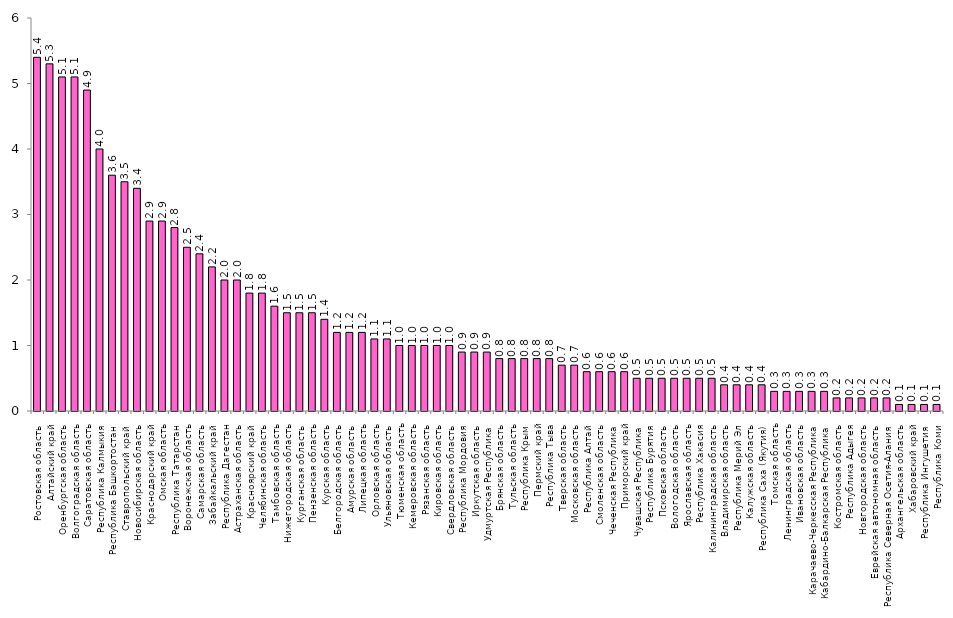
| Category | Series 0 |
|---|---|
| Ростовская область | 5.4 |
| Алтайский край | 5.3 |
| Оренбургская область | 5.1 |
| Волгоградская область | 5.1 |
| Саратовская область | 4.9 |
| Республика Калмыкия | 4 |
| Республика Башкортостан | 3.6 |
| Ставропольский край | 3.5 |
| Новосибирская область | 3.4 |
| Краснодарский край | 2.9 |
| Омская область | 2.9 |
| Республика Татарстан | 2.8 |
| Воронежская область | 2.5 |
| Самарская область | 2.4 |
| Забайкальский край | 2.2 |
| Республика Дагестан | 2 |
| Астраханская область | 2 |
| Красноярский край | 1.8 |
| Челябинская область | 1.8 |
| Тамбовская область | 1.6 |
| Нижегородская область | 1.5 |
| Курганская область | 1.5 |
| Пензенская область | 1.5 |
| Курская область | 1.4 |
| Белгородская область | 1.2 |
| Амурская область | 1.2 |
| Липецкая область | 1.2 |
| Орловская область | 1.1 |
| Ульяновская область | 1.1 |
| Тюменская область | 1 |
| Кемеровская область | 1 |
| Рязанская область | 1 |
| Кировская область | 1 |
| Свердловская область | 1 |
| Республика Мордовия | 0.9 |
| Иркутская область | 0.9 |
| Удмуртская Республика | 0.9 |
| Брянская область | 0.8 |
| Тульская область | 0.8 |
| Республика Крым | 0.8 |
| Пермский край | 0.8 |
| Республика Тыва | 0.8 |
| Тверская область | 0.7 |
| Московская область | 0.7 |
| Республика Алтай | 0.6 |
| Смоленская область | 0.6 |
| Чеченская Республика | 0.6 |
| Приморский край | 0.6 |
| Чувашская Республика | 0.5 |
| Республика Бурятия | 0.5 |
| Псковская область | 0.5 |
| Вологодская область | 0.5 |
| Ярославская область | 0.5 |
| Республика Хакасия | 0.5 |
| Калининградская область | 0.5 |
| Владимирская область | 0.4 |
| Республика Мерий Эл | 0.4 |
| Калужская область | 0.4 |
| Республика Саха (Якутия) | 0.4 |
| Томская область | 0.3 |
| Ленинградская область | 0.3 |
| Ивановская область | 0.3 |
| Карачаево-Черкесская Республика | 0.3 |
| Кабардино-Балкарская Республика | 0.3 |
| Костромская область | 0.2 |
| Республика Адыгея | 0.2 |
| Новгородская область | 0.2 |
| Еврейская автономная область | 0.2 |
| Республика Северная Осетия-Алания | 0.2 |
| Архангельская область | 0.1 |
| Хабаровский край | 0.1 |
| Республика Ингушетия | 0.1 |
| Республика Коми | 0.1 |